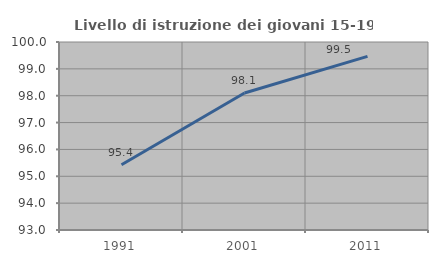
| Category | Livello di istruzione dei giovani 15-19 anni |
|---|---|
| 1991.0 | 95.431 |
| 2001.0 | 98.103 |
| 2011.0 | 99.465 |